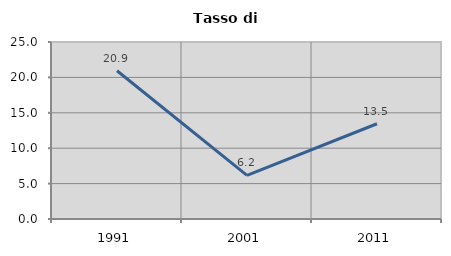
| Category | Tasso di disoccupazione   |
|---|---|
| 1991.0 | 20.945 |
| 2001.0 | 6.158 |
| 2011.0 | 13.453 |